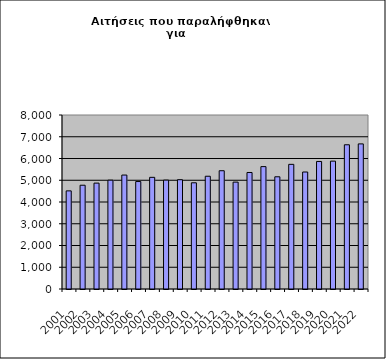
| Category | Series 1 |
|---|---|
| 2001.0 | 4512 |
| 2002.0 | 4771 |
| 2003.0 | 4868 |
| 2004.0 | 5004 |
| 2005.0 | 5239 |
| 2006.0 | 4941 |
| 2007.0 | 5134 |
| 2008.0 | 5007 |
| 2009.0 | 5025 |
| 2010.0 | 4883 |
| 2011.0 | 5184 |
| 2012.0 | 5438 |
| 2013.0 | 4914 |
| 2014.0 | 5357 |
| 2015.0 | 5627 |
| 2016.0 | 5159 |
| 2017.0 | 5731 |
| 2018.0 | 5379 |
| 2019.0 | 5864 |
| 2020.0 | 5879 |
| 2021.0 | 6631 |
| 2022.0 | 6671 |